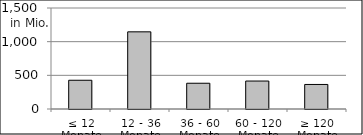
| Category | Volumen |
|---|---|
| ≤ 12 Monate | 426865731.07 |
| 12 - 36 Monate | 1146040502.25 |
| 36 - 60 Monate | 382644821.51 |
| 60 - 120 Monate | 415174615.8 |
| ≥ 120 Monate | 364330054.443 |